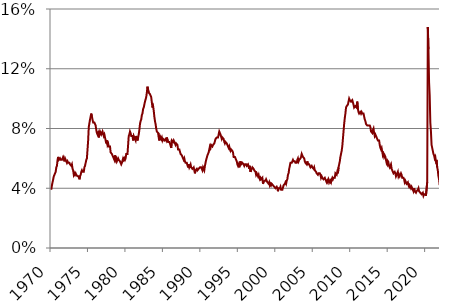
| Category | Series 0 |
|---|---|
| 1970.0 | 3.9 |
| 1970.0 | 4.2 |
| 1970.0 | 4.4 |
| 1970.0 | 4.6 |
| 1970.0 | 4.8 |
| 1970.0 | 4.9 |
| 1970.0 | 5 |
| 1970.0 | 5.1 |
| 1970.0 | 5.4 |
| 1970.0 | 5.5 |
| 1970.0 | 5.9 |
| 1970.0 | 6.1 |
| 1971.0 | 5.9 |
| 1971.0 | 5.9 |
| 1971.0 | 6 |
| 1971.0 | 5.9 |
| 1971.0 | 5.9 |
| 1971.0 | 5.9 |
| 1971.0 | 6 |
| 1971.0 | 6.1 |
| 1971.0 | 6 |
| 1971.0 | 5.8 |
| 1971.0 | 6 |
| 1971.0 | 6 |
| 1972.0 | 5.8 |
| 1972.0 | 5.7 |
| 1972.0 | 5.8 |
| 1972.0 | 5.7 |
| 1972.0 | 5.7 |
| 1972.0 | 5.7 |
| 1972.0 | 5.6 |
| 1972.0 | 5.6 |
| 1972.0 | 5.5 |
| 1972.0 | 5.6 |
| 1972.0 | 5.3 |
| 1972.0 | 5.2 |
| 1973.0 | 4.9 |
| 1973.0 | 5 |
| 1973.0 | 4.9 |
| 1973.0 | 5 |
| 1973.0 | 4.9 |
| 1973.0 | 4.9 |
| 1973.0 | 4.8 |
| 1973.0 | 4.8 |
| 1973.0 | 4.8 |
| 1973.0 | 4.6 |
| 1973.0 | 4.8 |
| 1973.0 | 4.9 |
| 1974.0 | 5.1 |
| 1974.0 | 5.2 |
| 1974.0 | 5.1 |
| 1974.0 | 5.1 |
| 1974.0 | 5.1 |
| 1974.0 | 5.4 |
| 1974.0 | 5.5 |
| 1974.0 | 5.5 |
| 1974.0 | 5.9 |
| 1974.0 | 6 |
| 1974.0 | 6.6 |
| 1974.0 | 7.2 |
| 1975.0 | 8.1 |
| 1975.0 | 8.1 |
| 1975.0 | 8.6 |
| 1975.0 | 8.8 |
| 1975.0 | 9 |
| 1975.0 | 8.8 |
| 1975.0 | 8.6 |
| 1975.0 | 8.4 |
| 1975.0 | 8.4 |
| 1975.0 | 8.4 |
| 1975.0 | 8.3 |
| 1975.0 | 8.2 |
| 1976.0 | 7.9 |
| 1976.0 | 7.7 |
| 1976.0 | 7.6 |
| 1976.0 | 7.7 |
| 1976.0 | 7.4 |
| 1976.0 | 7.6 |
| 1976.0 | 7.8 |
| 1976.0 | 7.8 |
| 1976.0 | 7.6 |
| 1976.0 | 7.7 |
| 1976.0 | 7.8 |
| 1976.0 | 7.8 |
| 1977.0 | 7.5 |
| 1977.0 | 7.6 |
| 1977.0 | 7.4 |
| 1977.0 | 7.2 |
| 1977.0 | 7 |
| 1977.0 | 7.2 |
| 1977.0 | 6.9 |
| 1977.0 | 7 |
| 1977.0 | 6.8 |
| 1977.0 | 6.8 |
| 1977.0 | 6.8 |
| 1977.0 | 6.4 |
| 1978.0 | 6.4 |
| 1978.0 | 6.3 |
| 1978.0 | 6.3 |
| 1978.0 | 6.1 |
| 1978.0 | 6 |
| 1978.0 | 5.9 |
| 1978.0 | 6.2 |
| 1978.0 | 5.9 |
| 1978.0 | 6 |
| 1978.0 | 5.8 |
| 1978.0 | 5.9 |
| 1978.0 | 6 |
| 1979.0 | 5.9 |
| 1979.0 | 5.9 |
| 1979.0 | 5.8 |
| 1979.0 | 5.8 |
| 1979.0 | 5.6 |
| 1979.0 | 5.7 |
| 1979.0 | 5.7 |
| 1979.0 | 6 |
| 1979.0 | 5.9 |
| 1979.0 | 6 |
| 1979.0 | 5.9 |
| 1979.0 | 6 |
| 1980.0 | 6.3 |
| 1980.0 | 6.3 |
| 1980.0 | 6.3 |
| 1980.0 | 6.9 |
| 1980.0 | 7.5 |
| 1980.0 | 7.6 |
| 1980.0 | 7.8 |
| 1980.0 | 7.7 |
| 1980.0 | 7.5 |
| 1980.0 | 7.5 |
| 1980.0 | 7.5 |
| 1980.0 | 7.2 |
| 1981.0 | 7.5 |
| 1981.0 | 7.4 |
| 1981.0 | 7.4 |
| 1981.0 | 7.2 |
| 1981.0 | 7.5 |
| 1981.0 | 7.5 |
| 1981.0 | 7.2 |
| 1981.0 | 7.4 |
| 1981.0 | 7.6 |
| 1981.0 | 7.9 |
| 1981.0 | 8.3 |
| 1981.0 | 8.5 |
| 1982.0 | 8.6 |
| 1982.0 | 8.9 |
| 1982.0 | 9 |
| 1982.0 | 9.3 |
| 1982.0 | 9.4 |
| 1982.0 | 9.6 |
| 1982.0 | 9.8 |
| 1982.0 | 9.8 |
| 1982.0 | 10.1 |
| 1982.0 | 10.4 |
| 1982.0 | 10.8 |
| 1982.0 | 10.8 |
| 1983.0 | 10.4 |
| 1983.0 | 10.4 |
| 1983.0 | 10.3 |
| 1983.0 | 10.2 |
| 1983.0 | 10.1 |
| 1983.0 | 10.1 |
| 1983.0 | 9.4 |
| 1983.0 | 9.5 |
| 1983.0 | 9.2 |
| 1983.0 | 8.8 |
| 1983.0 | 8.5 |
| 1983.0 | 8.3 |
| 1984.0 | 8 |
| 1984.0 | 7.8 |
| 1984.0 | 7.8 |
| 1984.0 | 7.7 |
| 1984.0 | 7.4 |
| 1984.0 | 7.2 |
| 1984.0 | 7.5 |
| 1984.0 | 7.5 |
| 1984.0 | 7.3 |
| 1984.0 | 7.4 |
| 1984.0 | 7.2 |
| 1984.0 | 7.3 |
| 1985.0 | 7.3 |
| 1985.0 | 7.2 |
| 1985.0 | 7.2 |
| 1985.0 | 7.3 |
| 1985.0 | 7.2 |
| 1985.0 | 7.4 |
| 1985.0 | 7.4 |
| 1985.0 | 7.1 |
| 1985.0 | 7.1 |
| 1985.0 | 7.1 |
| 1985.0 | 7 |
| 1985.0 | 7 |
| 1986.0 | 6.7 |
| 1986.0 | 7.2 |
| 1986.0 | 7.2 |
| 1986.0 | 7.1 |
| 1986.0 | 7.2 |
| 1986.0 | 7.2 |
| 1986.0 | 7 |
| 1986.0 | 6.9 |
| 1986.0 | 7 |
| 1986.0 | 7 |
| 1986.0 | 6.9 |
| 1986.0 | 6.6 |
| 1987.0 | 6.6 |
| 1987.0 | 6.6 |
| 1987.0 | 6.6 |
| 1987.0 | 6.3 |
| 1987.0 | 6.3 |
| 1987.0 | 6.2 |
| 1987.0 | 6.1 |
| 1987.0 | 6 |
| 1987.0 | 5.9 |
| 1987.0 | 6 |
| 1987.0 | 5.8 |
| 1987.0 | 5.7 |
| 1988.0 | 5.7 |
| 1988.0 | 5.7 |
| 1988.0 | 5.7 |
| 1988.0 | 5.4 |
| 1988.0 | 5.6 |
| 1988.0 | 5.4 |
| 1988.0 | 5.4 |
| 1988.0 | 5.6 |
| 1988.0 | 5.4 |
| 1988.0 | 5.4 |
| 1988.0 | 5.3 |
| 1988.0 | 5.3 |
| 1989.0 | 5.4 |
| 1989.0 | 5.2 |
| 1989.0 | 5 |
| 1989.0 | 5.2 |
| 1989.0 | 5.2 |
| 1989.0 | 5.3 |
| 1989.0 | 5.2 |
| 1989.0 | 5.2 |
| 1989.0 | 5.3 |
| 1989.0 | 5.3 |
| 1989.0 | 5.4 |
| 1989.0 | 5.4 |
| 1990.0 | 5.4 |
| 1990.0 | 5.3 |
| 1990.0 | 5.2 |
| 1990.0 | 5.4 |
| 1990.0 | 5.4 |
| 1990.0 | 5.2 |
| 1990.0 | 5.5 |
| 1990.0 | 5.7 |
| 1990.0 | 5.9 |
| 1990.0 | 5.9 |
| 1990.0 | 6.2 |
| 1990.0 | 6.3 |
| 1991.0 | 6.4 |
| 1991.0 | 6.6 |
| 1991.0 | 6.8 |
| 1991.0 | 6.7 |
| 1991.0 | 6.9 |
| 1991.0 | 6.9 |
| 1991.0 | 6.8 |
| 1991.0 | 6.9 |
| 1991.0 | 6.9 |
| 1991.0 | 7 |
| 1991.0 | 7 |
| 1991.0 | 7.3 |
| 1992.0 | 7.3 |
| 1992.0 | 7.4 |
| 1992.0 | 7.4 |
| 1992.0 | 7.4 |
| 1992.0 | 7.6 |
| 1992.0 | 7.8 |
| 1992.0 | 7.7 |
| 1992.0 | 7.6 |
| 1992.0 | 7.6 |
| 1992.0 | 7.3 |
| 1992.0 | 7.4 |
| 1992.0 | 7.4 |
| 1993.0 | 7.3 |
| 1993.0 | 7.1 |
| 1993.0 | 7 |
| 1993.0 | 7.1 |
| 1993.0 | 7.1 |
| 1993.0 | 7 |
| 1993.0 | 6.9 |
| 1993.0 | 6.8 |
| 1993.0 | 6.7 |
| 1993.0 | 6.8 |
| 1993.0 | 6.6 |
| 1993.0 | 6.5 |
| 1994.0 | 6.6 |
| 1994.0 | 6.6 |
| 1994.0 | 6.5 |
| 1994.0 | 6.4 |
| 1994.0 | 6.1 |
| 1994.0 | 6.1 |
| 1994.0 | 6.1 |
| 1994.0 | 6 |
| 1994.0 | 5.9 |
| 1994.0 | 5.8 |
| 1994.0 | 5.6 |
| 1994.0 | 5.5 |
| 1995.0 | 5.6 |
| 1995.0 | 5.4 |
| 1995.0 | 5.4 |
| 1995.0 | 5.8 |
| 1995.0 | 5.6 |
| 1995.0 | 5.6 |
| 1995.0 | 5.7 |
| 1995.0 | 5.7 |
| 1995.0 | 5.6 |
| 1995.0 | 5.5 |
| 1995.0 | 5.6 |
| 1995.0 | 5.6 |
| 1996.0 | 5.6 |
| 1996.0 | 5.5 |
| 1996.0 | 5.5 |
| 1996.0 | 5.6 |
| 1996.0 | 5.6 |
| 1996.0 | 5.3 |
| 1996.0 | 5.5 |
| 1996.0 | 5.1 |
| 1996.0 | 5.2 |
| 1996.0 | 5.2 |
| 1996.0 | 5.4 |
| 1996.0 | 5.4 |
| 1997.0 | 5.3 |
| 1997.0 | 5.2 |
| 1997.0 | 5.2 |
| 1997.0 | 5.1 |
| 1997.0 | 4.9 |
| 1997.0 | 5 |
| 1997.0 | 4.9 |
| 1997.0 | 4.8 |
| 1997.0 | 4.9 |
| 1997.0 | 4.7 |
| 1997.0 | 4.6 |
| 1997.0 | 4.7 |
| 1998.0 | 4.6 |
| 1998.0 | 4.6 |
| 1998.0 | 4.7 |
| 1998.0 | 4.3 |
| 1998.0 | 4.4 |
| 1998.0 | 4.5 |
| 1998.0 | 4.5 |
| 1998.0 | 4.5 |
| 1998.0 | 4.6 |
| 1998.0 | 4.5 |
| 1998.0 | 4.4 |
| 1998.0 | 4.4 |
| 1999.0 | 4.3 |
| 1999.0 | 4.4 |
| 1999.0 | 4.2 |
| 1999.0 | 4.3 |
| 1999.0 | 4.2 |
| 1999.0 | 4.3 |
| 1999.0 | 4.3 |
| 1999.0 | 4.2 |
| 1999.0 | 4.2 |
| 1999.0 | 4.1 |
| 1999.0 | 4.1 |
| 1999.0 | 4 |
| 2000.0 | 4 |
| 2000.0 | 4.1 |
| 2000.0 | 4 |
| 2000.0 | 3.8 |
| 2000.0 | 4 |
| 2000.0 | 4 |
| 2000.0 | 4 |
| 2000.0 | 4.1 |
| 2000.0 | 3.9 |
| 2000.0 | 3.9 |
| 2000.0 | 3.9 |
| 2000.0 | 3.9 |
| 2001.0 | 4.2 |
| 2001.0 | 4.2 |
| 2001.0 | 4.3 |
| 2001.0 | 4.4 |
| 2001.0 | 4.3 |
| 2001.0 | 4.5 |
| 2001.0 | 4.6 |
| 2001.0 | 4.9 |
| 2001.0 | 5 |
| 2001.0 | 5.3 |
| 2001.0 | 5.5 |
| 2001.0 | 5.7 |
| 2002.0 | 5.7 |
| 2002.0 | 5.7 |
| 2002.0 | 5.7 |
| 2002.0 | 5.9 |
| 2002.0 | 5.8 |
| 2002.0 | 5.8 |
| 2002.0 | 5.8 |
| 2002.0 | 5.7 |
| 2002.0 | 5.7 |
| 2002.0 | 5.7 |
| 2002.0 | 5.9 |
| 2002.0 | 6 |
| 2003.0 | 5.8 |
| 2003.0 | 5.9 |
| 2003.0 | 5.9 |
| 2003.0 | 6 |
| 2003.0 | 6.1 |
| 2003.0 | 6.3 |
| 2003.0 | 6.2 |
| 2003.0 | 6.1 |
| 2003.0 | 6.1 |
| 2003.0 | 6 |
| 2003.0 | 5.8 |
| 2003.0 | 5.7 |
| 2004.0 | 5.7 |
| 2004.0 | 5.6 |
| 2004.0 | 5.8 |
| 2004.0 | 5.6 |
| 2004.0 | 5.6 |
| 2004.0 | 5.6 |
| 2004.0 | 5.5 |
| 2004.0 | 5.4 |
| 2004.0 | 5.4 |
| 2004.0 | 5.5 |
| 2004.0 | 5.4 |
| 2004.0 | 5.4 |
| 2005.0 | 5.3 |
| 2005.0 | 5.4 |
| 2005.0 | 5.2 |
| 2005.0 | 5.2 |
| 2005.0 | 5.1 |
| 2005.0 | 5 |
| 2005.0 | 5 |
| 2005.0 | 4.9 |
| 2005.0 | 5 |
| 2005.0 | 5 |
| 2005.0 | 5 |
| 2005.0 | 4.9 |
| 2006.0 | 4.7 |
| 2006.0 | 4.8 |
| 2006.0 | 4.7 |
| 2006.0 | 4.7 |
| 2006.0 | 4.6 |
| 2006.0 | 4.6 |
| 2006.0 | 4.7 |
| 2006.0 | 4.7 |
| 2006.0 | 4.5 |
| 2006.0 | 4.4 |
| 2006.0 | 4.5 |
| 2006.0 | 4.4 |
| 2007.0 | 4.6 |
| 2007.0 | 4.5 |
| 2007.0 | 4.4 |
| 2007.0 | 4.5 |
| 2007.0 | 4.4 |
| 2007.0 | 4.6 |
| 2007.0 | 4.7 |
| 2007.0 | 4.6 |
| 2007.0 | 4.7 |
| 2007.0 | 4.7 |
| 2007.0 | 4.7 |
| 2007.0 | 5 |
| 2008.0 | 5 |
| 2008.0 | 4.9 |
| 2008.0 | 5.1 |
| 2008.0 | 5 |
| 2008.0 | 5.4 |
| 2008.0 | 5.6 |
| 2008.0 | 5.8 |
| 2008.0 | 6.1 |
| 2008.0 | 6.1 |
| 2008.0 | 6.5 |
| 2008.0 | 6.8 |
| 2008.0 | 7.3 |
| 2009.0 | 7.8 |
| 2009.0 | 8.3 |
| 2009.0 | 8.7 |
| 2009.0 | 9 |
| 2009.0 | 9.4 |
| 2009.0 | 9.5 |
| 2009.0 | 9.5 |
| 2009.0 | 9.6 |
| 2009.0 | 9.8 |
| 2009.0 | 10 |
| 2009.0 | 9.9 |
| 2009.0 | 9.9 |
| 2010.0 | 9.8 |
| 2010.0 | 9.8 |
| 2010.0 | 9.9 |
| 2010.0 | 9.9 |
| 2010.0 | 9.6 |
| 2010.0 | 9.4 |
| 2010.0 | 9.4 |
| 2010.0 | 9.5 |
| 2010.0 | 9.5 |
| 2010.0 | 9.4 |
| 2010.0 | 9.8 |
| 2010.0 | 9.3 |
| 2011.0 | 9.1 |
| 2011.0 | 9 |
| 2011.0 | 9 |
| 2011.0 | 9.1 |
| 2011.0 | 9 |
| 2011.0 | 9.1 |
| 2011.0 | 9 |
| 2011.0 | 9 |
| 2011.0 | 9 |
| 2011.0 | 8.8 |
| 2011.0 | 8.6 |
| 2011.0 | 8.5 |
| 2012.0 | 8.3 |
| 2012.0 | 8.3 |
| 2012.0 | 8.2 |
| 2012.0 | 8.2 |
| 2012.0 | 8.2 |
| 2012.0 | 8.2 |
| 2012.0 | 8.2 |
| 2012.0 | 8.1 |
| 2012.0 | 7.8 |
| 2012.0 | 7.8 |
| 2012.0 | 7.7 |
| 2012.0 | 7.9 |
| 2013.0 | 8 |
| 2013.0 | 7.7 |
| 2013.0 | 7.5 |
| 2013.0 | 7.6 |
| 2013.0 | 7.5 |
| 2013.0 | 7.5 |
| 2013.0 | 7.3 |
| 2013.0 | 7.2 |
| 2013.0 | 7.2 |
| 2013.0 | 7.2 |
| 2013.0 | 6.9 |
| 2013.0 | 6.7 |
| 2014.0 | 6.6 |
| 2014.0 | 6.7 |
| 2014.0 | 6.7 |
| 2014.0 | 6.2 |
| 2014.0 | 6.3 |
| 2014.0 | 6.1 |
| 2014.0 | 6.2 |
| 2014.0 | 6.1 |
| 2014.0 | 5.9 |
| 2014.0 | 5.7 |
| 2014.0 | 5.8 |
| 2014.0 | 5.6 |
| 2015.0 | 5.7 |
| 2015.0 | 5.5 |
| 2015.0 | 5.4 |
| 2015.0 | 5.4 |
| 2015.0 | 5.6 |
| 2015.0 | 5.3 |
| 2015.0 | 5.2 |
| 2015.0 | 5.1 |
| 2015.0 | 5 |
| 2015.0 | 5 |
| 2015.0 | 5.1 |
| 2015.0 | 5 |
| 2016.0 | 4.8 |
| 2016.0 | 4.9 |
| 2016.0 | 5 |
| 2016.0 | 5.1 |
| 2016.0 | 4.8 |
| 2016.0 | 4.9 |
| 2016.0 | 4.8 |
| 2016.0 | 4.9 |
| 2016.0 | 5 |
| 2016.0 | 4.9 |
| 2016.0 | 4.7 |
| 2016.0 | 4.7 |
| 2017.0 | 4.7 |
| 2017.0 | 4.6 |
| 2017.0 | 4.4 |
| 2017.0 | 4.5 |
| 2017.0 | 4.4 |
| 2017.0 | 4.3 |
| 2017.0 | 4.3 |
| 2017.0 | 4.4 |
| 2017.0 | 4.2 |
| 2017.0 | 4.1 |
| 2017.0 | 4.2 |
| 2017.0 | 4.1 |
| 2018.0 | 4 |
| 2018.0 | 4.1 |
| 2018.0 | 4 |
| 2018.0 | 4 |
| 2018.0 | 3.8 |
| 2018.0 | 4 |
| 2018.0 | 3.8 |
| 2018.0 | 3.8 |
| 2018.0 | 3.7 |
| 2018.0 | 3.8 |
| 2018.0 | 3.8 |
| 2018.0 | 3.9 |
| 2019.0 | 4 |
| 2019.0 | 3.8 |
| 2019.0 | 3.8 |
| 2019.0 | 3.7 |
| 2019.0 | 3.7 |
| 2019.0 | 3.6 |
| 2019.0 | 3.6 |
| 2019.0 | 3.7 |
| 2019.0 | 3.5 |
| 2019.0 | 3.6 |
| 2019.0 | 3.6 |
| 2019.0 | 3.6 |
| 2020.0 | 3.5 |
| 2020.0 | 3.5 |
| 2020.0 | 4.4 |
| 2020.0 | 14.8 |
| 2020.0 | 13.3 |
| 2020.0 | 11.1 |
| 2020.0 | 10.2 |
| 2020.0 | 8.4 |
| 2020.0 | 7.8 |
| 2020.0 | 6.9 |
| 2020.0 | 6.7 |
| 2020.0 | 6.7 |
| 2021.0 | 6.3 |
| 2021.0 | 6.2 |
| 2021.0 | 6 |
| 2021.0 | 6.1 |
| 2021.0 | 5.8 |
| 2021.0 | 5.9 |
| 2021.0 | 5.4 |
| 2021.0 | 5.2 |
| 2021.0 | 4.8 |
| 2021.0 | 4.6 |
| 2021.0 | 4.2 |